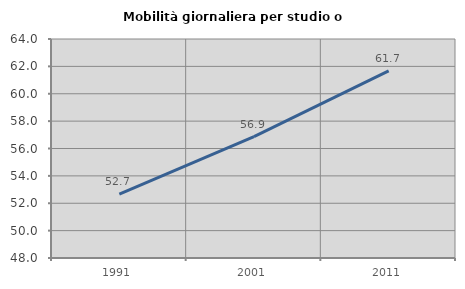
| Category | Mobilità giornaliera per studio o lavoro |
|---|---|
| 1991.0 | 52.675 |
| 2001.0 | 56.868 |
| 2011.0 | 61.673 |